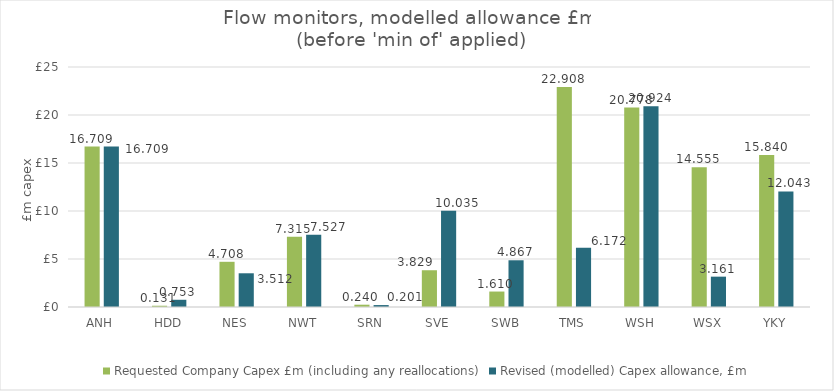
| Category | Requested Company Capex £m (including any reallocations) | Revised (modelled) Capex allowance, £m |
|---|---|---|
| ANH | 16.709 | 16.709 |
| HDD | 0.131 | 0.753 |
| NES | 4.708 | 3.512 |
| NWT | 7.315 | 7.527 |
| SRN | 0.24 | 0.201 |
| SVE | 3.829 | 10.035 |
| SWB | 1.61 | 4.867 |
| TMS | 22.908 | 6.172 |
| WSH | 20.778 | 20.924 |
| WSX | 14.555 | 3.161 |
| YKY | 15.84 | 12.043 |